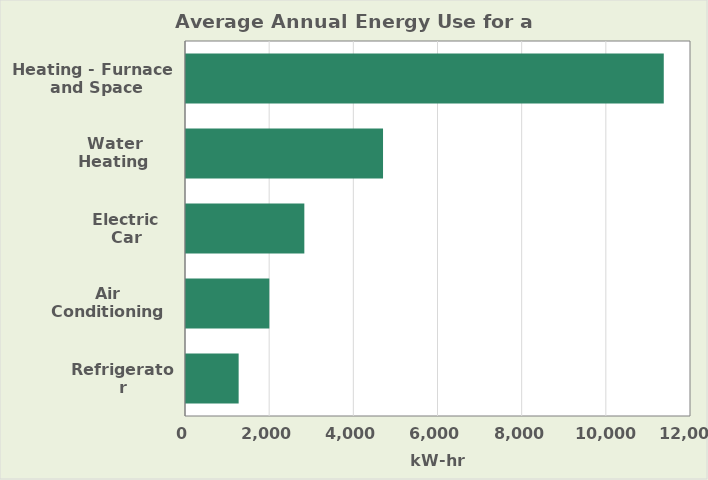
| Category | Estimated Annual Energy Use (kWhr) |
|---|---|
| Refrigerator | 1251 |
| Air Conditioning | 1980 |
| Electric Car | 2812 |
| Water Heating | 4682 |
| Heating - Furnace
 and Space Heating | 11353 |